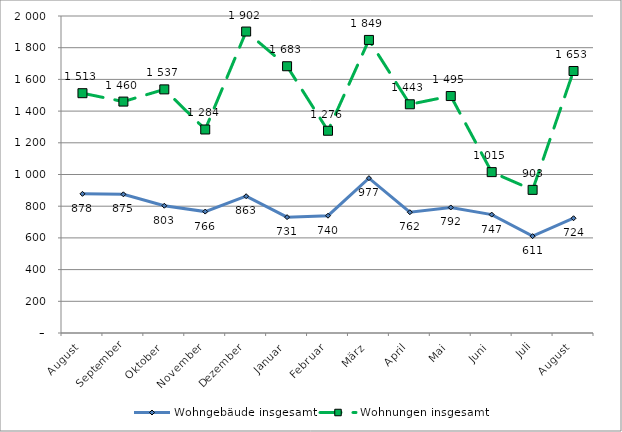
| Category | Wohngebäude insgesamt | Wohnungen insgesamt |
|---|---|---|
| August | 878 | 1513 |
| September | 875 | 1460 |
| Oktober | 803 | 1537 |
| November | 766 | 1284 |
| Dezember | 863 | 1902 |
| Januar | 731 | 1683 |
| Februar | 740 | 1276 |
| März | 977 | 1849 |
| April | 762 | 1443 |
| Mai | 792 | 1495 |
| Juni | 747 | 1015 |
| Juli | 611 | 903 |
| August | 724 | 1653 |